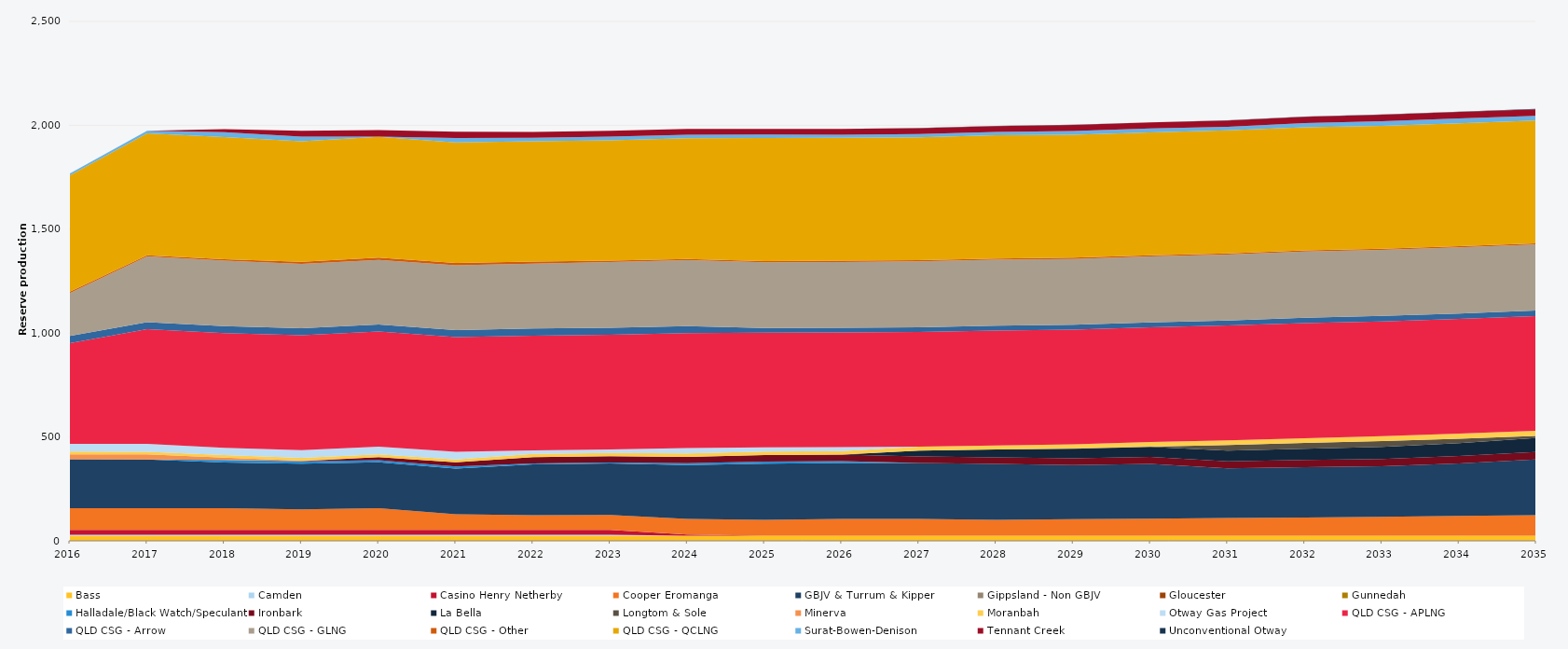
| Category | Bass | Camden | Casino Henry Netherby | Cooper Eromanga | GBJV & Turrum & Kipper | Gippsland - Non GBJV | Gloucester | Gunnedah | Halladale/Black Watch/Speculant | Ironbark | La Bella | Longtom & Sole | Minerva | Moranbah | Otway Gas Project | QLD CSG - APLNG | QLD CSG - Arrow | QLD CSG - GLNG | QLD CSG - Other | QLD CSG - QCLNG | Surat-Bowen-Denison | Tennant Creek | Unconventional Otway |
|---|---|---|---|---|---|---|---|---|---|---|---|---|---|---|---|---|---|---|---|---|---|---|---|
| 2016 | 24.522 | 5 | 23.12 | 105 | 235.041 | 0 | 0 | 0 | 0 | 0 | 0 | 0 | 23.79 | 12.867 | 38 | 484.599 | 34.038 | 207.333 | 5.856 | 559.871 | 9.633 | 0 | 0 |
| 2017 | 24.455 | 5 | 23.12 | 105 | 234.501 | 0 | 0 | 0 | 0 | 0 | 0 | 0 | 23.725 | 12.873 | 38 | 552.245 | 33.945 | 315.713 | 5.84 | 586.525 | 12.734 | 0 | 0 |
| 2018 | 24.455 | 5 | 23.12 | 104.043 | 220 | 0 | 0 | 0 | 12.649 | 0 | 0 | 0 | 11.034 | 13.04 | 34.022 | 552.245 | 33.945 | 315.648 | 5.84 | 588.841 | 23.155 | 14.55 | 0 |
| 2019 | 24.455 | 5 | 23.12 | 99.202 | 220 | 0 | 0 | 0 | 10.95 | 1.292 | 0 | 0 | 2.129 | 12.81 | 38 | 552.245 | 33.945 | 310.126 | 10.403 | 579.675 | 21.897 | 28.083 | 0 |
| 2020 | 24.522 | 5 | 23.12 | 105 | 220 | 0 | 0 | 0 | 10.95 | 14.318 | 0 | 0 | 0.073 | 12.781 | 38 | 553.758 | 34.038 | 310.988 | 10.419 | 581.403 | 1.396 | 30.893 | 0 |
| 2021 | 24.455 | 5 | 23.12 | 75.448 | 220 | 0 | 0 | 0 | 9.8 | 19.943 | 0 | 0 | 0 | 13.533 | 37.332 | 552.245 | 33.945 | 311.959 | 10.403 | 580.101 | 21.745 | 30.387 | 0 |
| 2022 | 24.455 | 5 | 23.12 | 70.92 | 244.118 | 0 | 0 | 0 | 5.381 | 30.17 | 0 | 0 | 0 | 15.298 | 17.094 | 552.245 | 33.945 | 311.898 | 10.403 | 579.606 | 16.741 | 27.517 | 0 |
| 2023 | 24.455 | 5 | 23.12 | 71.721 | 248.04 | 0 | 0 | 0 | 4.604 | 30.17 | 0 | 0 | 0 | 16.264 | 16.173 | 552.245 | 33.945 | 316.625 | 5.84 | 579.587 | 17.916 | 27.672 | 0 |
| 2024 | 24.522 | 0 | 5.3 | 75.393 | 258.954 | 0 | 0 | 0 | 9.196 | 31.053 | 0 | 0 | 0 | 16.79 | 24.83 | 553.758 | 34.038 | 317.359 | 5.856 | 580.592 | 17.19 | 27.368 | 0 |
| 2025 | 24.455 | 0 | 0 | 76.645 | 270 | 0 | 0 | 0 | 10.075 | 31.394 | 0 | 0 | 0 | 17.268 | 19.949 | 552.245 | 22.035 | 316.795 | 5.84 | 591.794 | 17.182 | 27.597 | 0 |
| 2026 | 24.455 | 0 | 0 | 80.807 | 270 | 0 | 0 | 0 | 8.396 | 31.196 | 0 | 0.011 | 0 | 17.518 | 18.205 | 552.245 | 22.841 | 316.693 | 5.84 | 591.753 | 15.248 | 27.771 | 0 |
| 2027 | 24.455 | 0 | 0 | 80.73 | 270 | 0 | 0 | 0 | 0 | 31.236 | 28.207 | 0.097 | 0 | 18.14 | 0 | 552.245 | 23.131 | 316.854 | 5.84 | 591.693 | 15.651 | 28.005 | 0.684 |
| 2028 | 24.522 | 0 | 0 | 76.947 | 268.454 | 0 | 0 | 0 | 0 | 31.572 | 37.832 | 0.101 | 0 | 18.99 | 0 | 553.758 | 23.47 | 317.828 | 5.856 | 593.234 | 15.835 | 28.198 | 1.008 |
| 2029 | 24.455 | 0 | 0 | 79.712 | 261.023 | 0 | 0 | 0 | 0 | 31.877 | 45.696 | 1.505 | 0 | 20.344 | 0 | 552.245 | 23.353 | 316.897 | 5.84 | 591.622 | 18.022 | 28.646 | 1.526 |
| 2030 | 24.455 | 0 | 0 | 82.416 | 263.403 | 0 | 0 | 0 | 0 | 33.128 | 48.707 | 1.566 | 0 | 21.608 | 0 | 552.245 | 23.602 | 317.279 | 5.84 | 591.579 | 18.895 | 29.018 | 0.779 |
| 2031 | 24.455 | 0 | 0 | 85.13 | 239.134 | 0 | 0 | 0 | 0 | 34.264 | 51.184 | 27.375 | 0 | 22.555 | 0 | 552.245 | 24.176 | 317.559 | 5.84 | 591.53 | 17.852 | 29.387 | 1.368 |
| 2032 | 24.522 | 0 | 0 | 87.912 | 241.848 | 0 | 0 | 0 | 0 | 35.162 | 53.89 | 27.45 | 0 | 23.473 | 0 | 553.758 | 25.27 | 318.687 | 5.856 | 593.07 | 19.818 | 30.262 | 1.539 |
| 2033 | 24.455 | 0 | 0 | 90.829 | 243.313 | 0 | 0 | 0 | 0 | 35.7 | 58.2 | 27.375 | 0 | 23.984 | 0 | 552.245 | 26.292 | 318.155 | 5.84 | 591.435 | 22.368 | 30.759 | 1.011 |
| 2034 | 24.455 | 0 | 0 | 95.483 | 252.994 | 0 | 0 | 0 | 0 | 35.888 | 61.378 | 21.076 | 0 | 24.559 | 0 | 552.245 | 26.478 | 318.338 | 5.84 | 591.394 | 23.173 | 31.073 | 1.762 |
| 2035 | 24.455 | 0 | 0 | 99.428 | 267.672 | 0 | 0 | 0 | 0 | 36.003 | 67.285 | 9.974 | 0 | 24.812 | 0 | 552.245 | 26.393 | 317.822 | 5.84 | 591.053 | 23.064 | 31.489 | 1.324 |